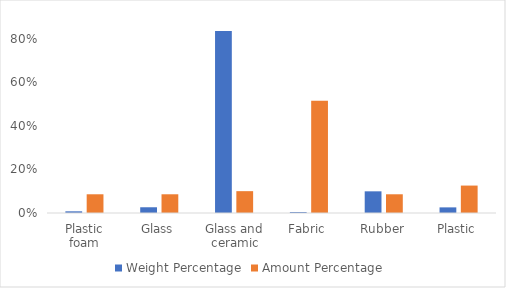
| Category | Weight Percentage | Amount Percentage  |
|---|---|---|
| Plastic foam | 0.008 | 0.086 |
| Glass | 0.026 | 0.086 |
| Glass and ceramic | 0.836 | 0.1 |
| Fabric | 0.005 | 0.516 |
| Rubber | 0.1 | 0.086 |
| Plastic | 0.026 | 0.126 |